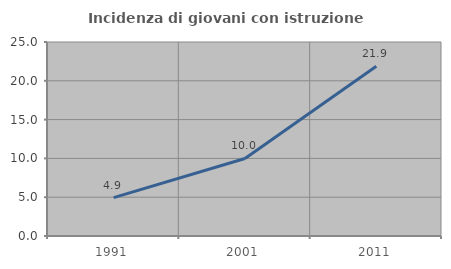
| Category | Incidenza di giovani con istruzione universitaria |
|---|---|
| 1991.0 | 4.938 |
| 2001.0 | 9.991 |
| 2011.0 | 21.882 |